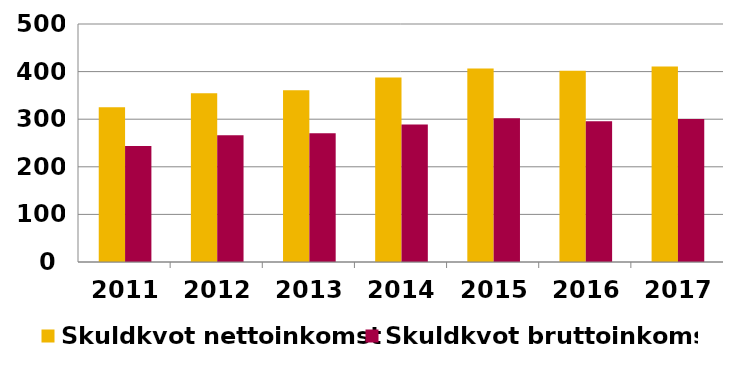
| Category | Skuldkvot nettoinkomst | Skuldkvot bruttoinkomst |
|---|---|---|
| 2011-07-03 | 324.873 | 243.906 |
| 2012-07-04 | 354.643 | 266.213 |
| 2013-07-05 | 360.954 | 270.578 |
| 2014-07-06 | 387.378 | 288.627 |
| 2015-07-07 | 406.313 | 301.958 |
| 2016-07-08 | 401.923 | 295.604 |
| 2017-07-09 | 410.692 | 300.372 |